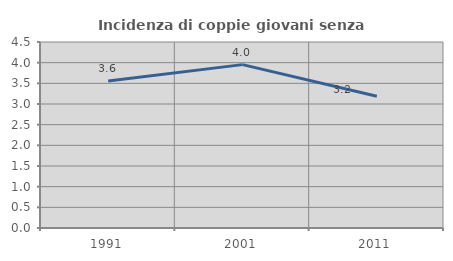
| Category | Incidenza di coppie giovani senza figli |
|---|---|
| 1991.0 | 3.557 |
| 2001.0 | 3.953 |
| 2011.0 | 3.187 |